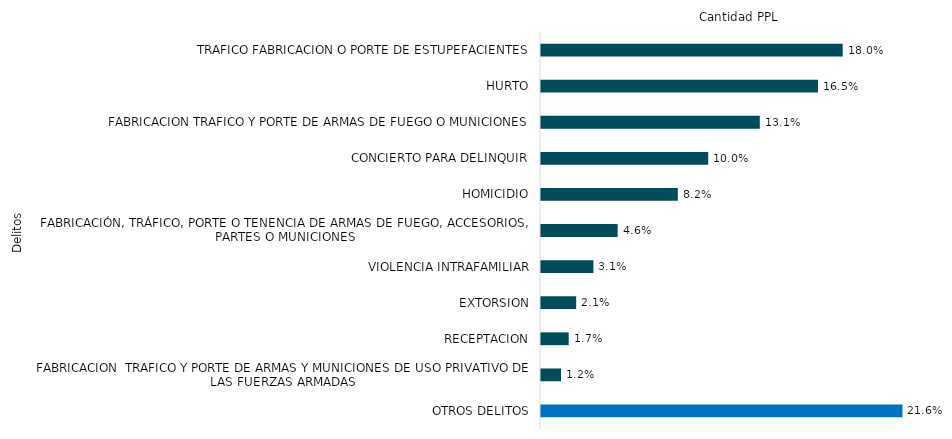
| Category | Series 0 |
|---|---|
| TRAFICO FABRICACION O PORTE DE ESTUPEFACIENTES | 15009 |
| HURTO | 13780 |
| FABRICACION TRAFICO Y PORTE DE ARMAS DE FUEGO O MUNICIONES | 10885 |
| CONCIERTO PARA DELINQUIR | 8319 |
| HOMICIDIO | 6807 |
| FABRICACIÓN, TRÁFICO, PORTE O TENENCIA DE ARMAS DE FUEGO, ACCESORIOS, PARTES O MUNICIONES | 3813 |
| VIOLENCIA INTRAFAMILIAR | 2607 |
| EXTORSION | 1750 |
| RECEPTACION | 1378 |
| FABRICACION  TRAFICO Y PORTE DE ARMAS Y MUNICIONES DE USO PRIVATIVO DE LAS FUERZAS ARMADAS | 996 |
| OTROS DELITOS | 17984 |